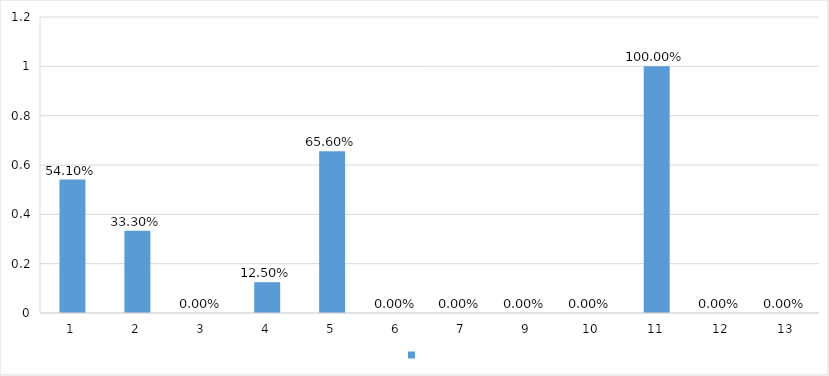
| Category | Series 0 |
|---|---|
| 1 | 0.541 |
| 2 | 0.333 |
| 3 | 0 |
| 4 | 0.125 |
| 5 | 0.656 |
| 6 | 0 |
| 7 | 0 |
| 9 | 0 |
| 10 | 0 |
| 11 | 1 |
| 12 | 0 |
| 13 | 0 |